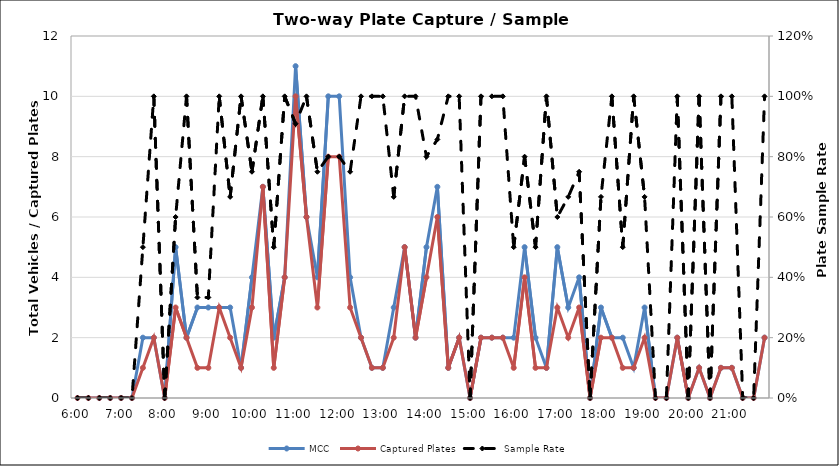
| Category | MCC | Captured Plates |
|---|---|---|
| 0.25 | 0 | 0 |
| 0.260416666666667 | 0 | 0 |
| 0.270833333333333 | 0 | 0 |
| 0.28125 | 0 | 0 |
| 0.291666666666667 | 0 | 0 |
| 0.302083333333333 | 0 | 0 |
| 0.3125 | 2 | 1 |
| 0.322916666666667 | 2 | 2 |
| 0.333333333333333 | 0 | 0 |
| 0.34375 | 5 | 3 |
| 0.354166666666667 | 2 | 2 |
| 0.364583333333333 | 3 | 1 |
| 0.375 | 3 | 1 |
| 0.385416666666667 | 3 | 3 |
| 0.395833333333333 | 3 | 2 |
| 0.40625 | 1 | 1 |
| 0.416666666666667 | 4 | 3 |
| 0.427083333333333 | 7 | 7 |
| 0.4375 | 2 | 1 |
| 0.447916666666667 | 4 | 4 |
| 0.458333333333333 | 11 | 10 |
| 0.46875 | 6 | 6 |
| 0.479166666666667 | 4 | 3 |
| 0.489583333333333 | 10 | 8 |
| 0.5 | 10 | 8 |
| 0.510416666666667 | 4 | 3 |
| 0.520833333333333 | 2 | 2 |
| 0.53125 | 1 | 1 |
| 0.541666666666667 | 1 | 1 |
| 0.552083333333333 | 3 | 2 |
| 0.5625 | 5 | 5 |
| 0.572916666666667 | 2 | 2 |
| 0.583333333333333 | 5 | 4 |
| 0.59375 | 7 | 6 |
| 0.604166666666667 | 1 | 1 |
| 0.614583333333333 | 2 | 2 |
| 0.625 | 0 | 0 |
| 0.635416666666667 | 2 | 2 |
| 0.645833333333333 | 2 | 2 |
| 0.65625 | 2 | 2 |
| 0.666666666666667 | 2 | 1 |
| 0.677083333333333 | 5 | 4 |
| 0.6875 | 2 | 1 |
| 0.697916666666667 | 1 | 1 |
| 0.708333333333333 | 5 | 3 |
| 0.71875 | 3 | 2 |
| 0.729166666666667 | 4 | 3 |
| 0.739583333333333 | 0 | 0 |
| 0.75 | 3 | 2 |
| 0.760416666666667 | 2 | 2 |
| 0.770833333333333 | 2 | 1 |
| 0.78125 | 1 | 1 |
| 0.791666666666667 | 3 | 2 |
| 0.802083333333333 | 0 | 0 |
| 0.8125 | 0 | 0 |
| 0.822916666666667 | 2 | 2 |
| 0.833333333333333 | 0 | 0 |
| 0.84375 | 1 | 1 |
| 0.854166666666667 | 0 | 0 |
| 0.864583333333333 | 1 | 1 |
| 0.875 | 1 | 1 |
| 0.885416666666667 | 0 | 0 |
| 0.895833333333333 | 0 | 0 |
| 0.90625 | 2 | 2 |